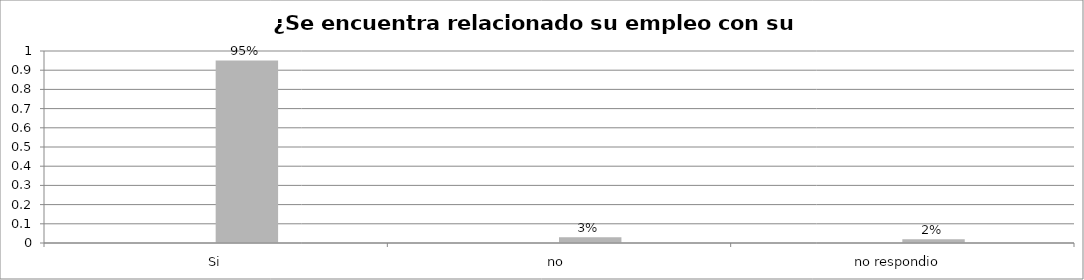
| Category | Series 0 | Series 1 | Series 2 | Series 3 |
|---|---|---|---|---|
| Si |  |  | 0.951 |  |
| no  |  |  | 0.029 |  |
| no respondio  |  |  | 0.02 |  |